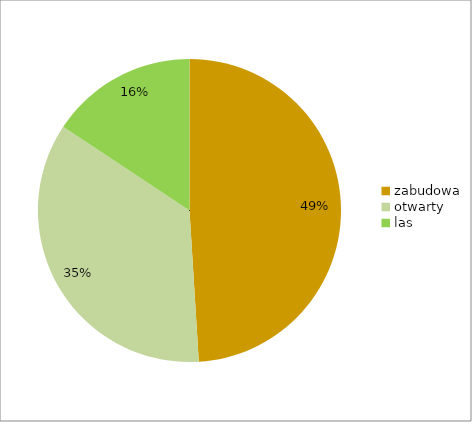
| Category | Series 0 |
|---|---|
| zabudowa | 0.49 |
| otwarty | 0.353 |
| las | 0.157 |